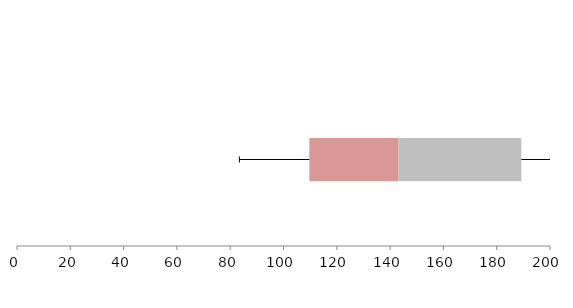
| Category | Series 1 | Series 2 | Series 3 |
|---|---|---|---|
| 0 | 109.689 | 33.453 | 46.098 |